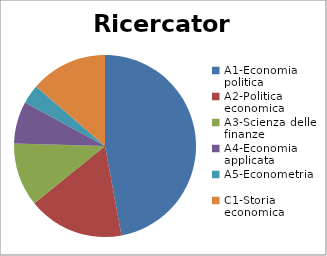
| Category | Ricercatori | Series 1 |
|---|---|---|
| A1-Economia politica | 138 |  |
| A2-Politica economica | 50 |  |
| A3-Scienza delle finanze | 33 |  |
| A4-Economia applicata | 22 |  |
| A5-Econometria | 10 |  |
| C1-Storia economica | 40 |  |